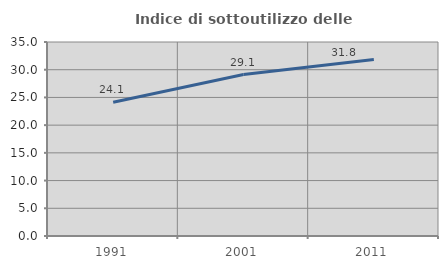
| Category | Indice di sottoutilizzo delle abitazioni  |
|---|---|
| 1991.0 | 24.139 |
| 2001.0 | 29.126 |
| 2011.0 | 31.85 |